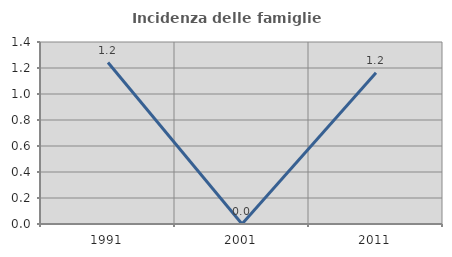
| Category | Incidenza delle famiglie numerose |
|---|---|
| 1991.0 | 1.242 |
| 2001.0 | 0 |
| 2011.0 | 1.163 |